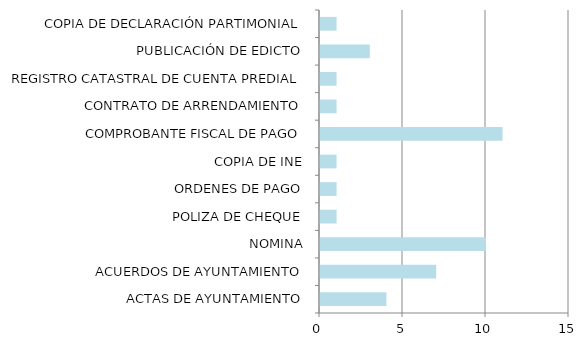
| Category | Series 0 |
|---|---|
| ACTAS DE AYUNTAMIENTO | 4 |
| ACUERDOS DE AYUNTAMIENTO | 7 |
| NOMINA | 10 |
| POLIZA DE CHEQUE | 1 |
| ORDENES DE PAGO | 1 |
| COPIA DE INE | 1 |
| COMPROBANTE FISCAL DE PAGO | 11 |
| CONTRATO DE ARRENDAMIENTO | 1 |
| REGISTRO CATASTRAL DE CUENTA PREDIAL | 1 |
| PUBLICACIÓN DE EDICTO | 3 |
| COPIA DE DECLARACIÓN PARTIMONIAL | 1 |